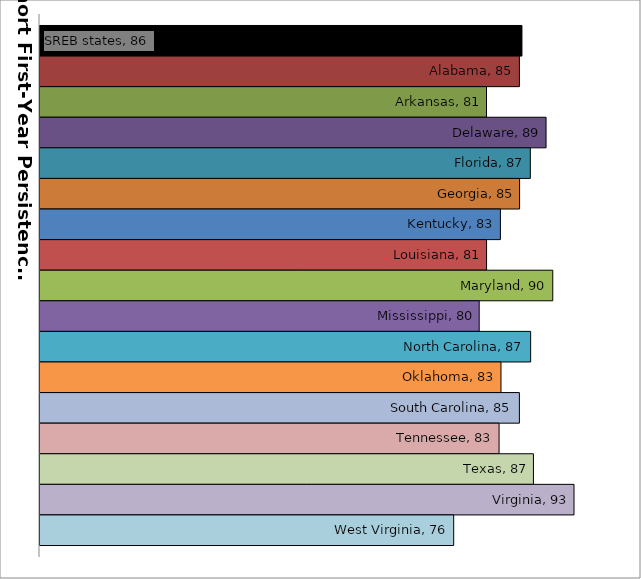
| Category | SREB states | Alabama | Arkansas | Delaware | Florida | Georgia | Kentucky | Louisiana | Maryland | Mississippi | North Carolina | Oklahoma | South Carolina | Tennessee | Texas | Virginia | West Virginia |
|---|---|---|---|---|---|---|---|---|---|---|---|---|---|---|---|---|---|
| 0 | 85.796 | 85.45 | 80.957 | 89.087 | 86.939 | 85.474 | 82.856 | 80.966 | 90.002 | 79.958 | 86.983 | 82.931 | 85.448 | 82.672 | 87.362 | 92.903 | 76.477 |